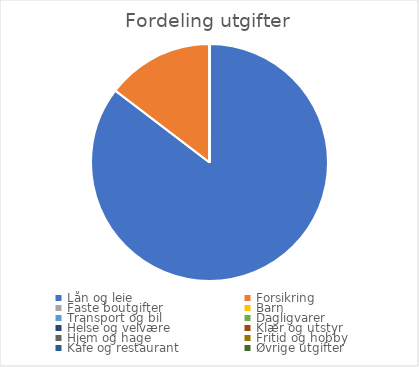
| Category | Series 0 |
|---|---|
| Lån og leie | 14000 |
| Forsikring | 2400 |
| Faste boutgifter | 0 |
| Barn | 0 |
| Transport og bil | 0 |
| Dagligvarer | 0 |
| Helse og velvære | 0 |
| Klær og utstyr | 0 |
| Hjem og hage | 0 |
| Fritid og hobby | 0 |
| Kafe og restaurant | 0 |
| Øvrige utgifter | 0 |